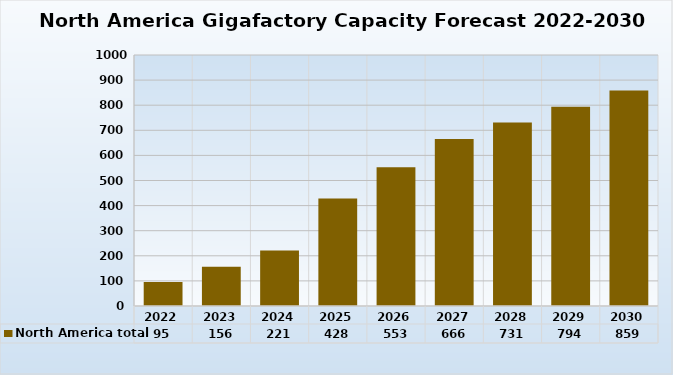
| Category | North America total |
|---|---|
| 2022.0 | 95.3 |
| 2023.0 | 156.1 |
| 2024.0 | 221.1 |
| 2025.0 | 428.1 |
| 2026.0 | 552.8 |
| 2027.0 | 665.8 |
| 2028.0 | 730.8 |
| 2029.0 | 793.8 |
| 2030.0 | 858.8 |